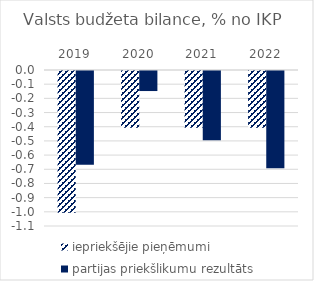
| Category | iepriekšējie pieņēmumi | partijas priekšlikumu rezultāts |
|---|---|---|
| 2019.0 | -1 | -0.661 |
| 2020.0 | -0.4 | -0.141 |
| 2021.0 | -0.4 | -0.488 |
| 2022.0 | -0.4 | -0.685 |